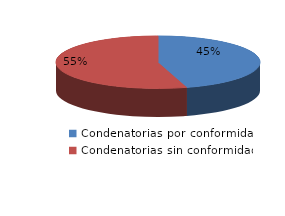
| Category | Series 0 |
|---|---|
| 0 | 5 |
| 1 | 6 |